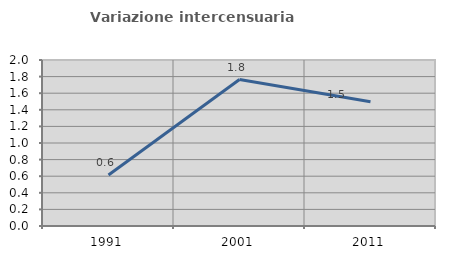
| Category | Variazione intercensuaria annua |
|---|---|
| 1991.0 | 0.614 |
| 2001.0 | 1.765 |
| 2011.0 | 1.497 |